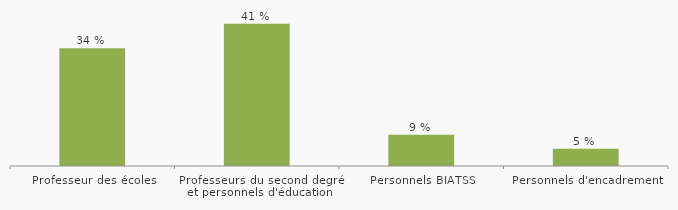
| Category | % |
|---|---|
| Professeur des écoles | 34 |
| Professeurs du second degré et personnels d'éducation | 41 |
| Personnels BIATSS | 9 |
| Personnels d'encadrement | 5 |